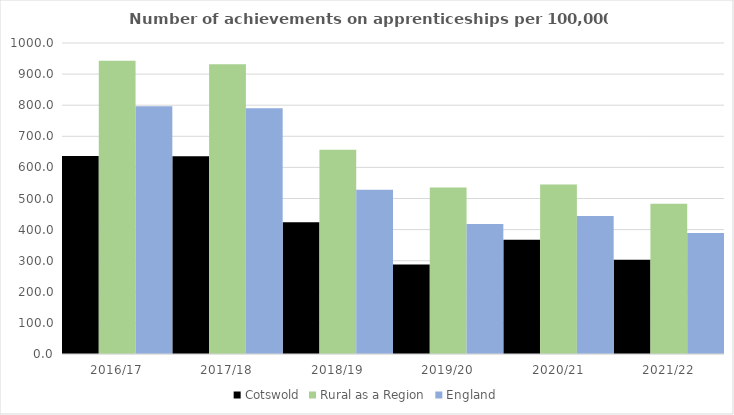
| Category | Cotswold | Rural as a Region | England |
|---|---|---|---|
| 2016/17 | 637 | 942.594 | 797 |
| 2017/18 | 636 | 931.709 | 790 |
| 2018/19 | 424 | 656.44 | 528 |
| 2019/20 | 288 | 535.552 | 418 |
| 2020/21 | 367 | 545.333 | 444 |
| 2021/22 | 303 | 482.936 | 389 |